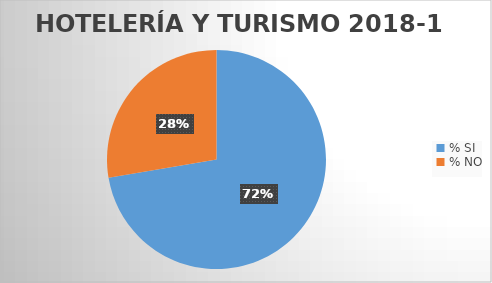
| Category | Series 0 |
|---|---|
| % SI | 72.321 |
| % NO | 27.679 |